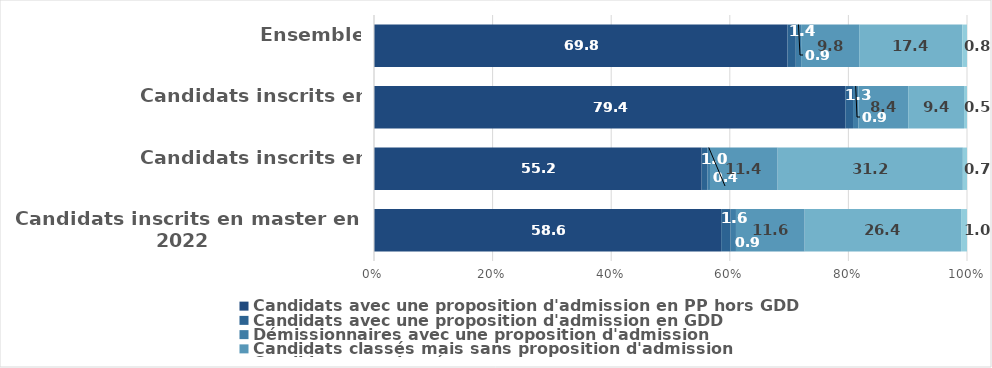
| Category | Candidats avec une proposition d'admission en PP hors GDD | Candidats avec une proposition d'admission en GDD | Démissionnaires avec une proposition d'admission | Candidats classés mais sans proposition d'admission | Candidats non classés | Démissionnaires sans proposition d'admission |
|---|---|---|---|---|---|---|
| Candidats inscrits en master en 2022 | 58.6 | 1.6 | 0.9 | 11.6 | 26.4 | 1 |
| Candidats inscrits en 
LP en 2022 | 55.2 | 1 | 0.4 | 11.4 | 31.2 | 0.7 |
| Candidats inscrits en 
L3 en 2022 | 79.4 | 1.3 | 0.9 | 8.4 | 9.4 | 0.5 |
| Ensemble | 69.8 | 1.4 | 0.9 | 9.8 | 17.4 | 0.8 |